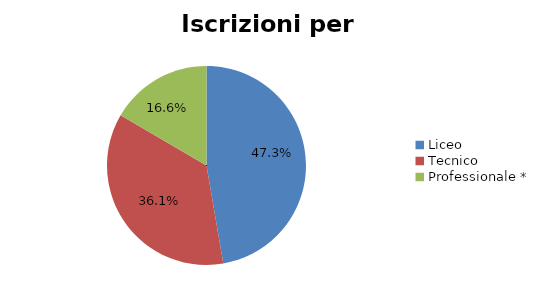
| Category | Series 0 |
|---|---|
| Liceo  | 17969 |
| Tecnico | 13717 |
| Professionale * | 6303 |